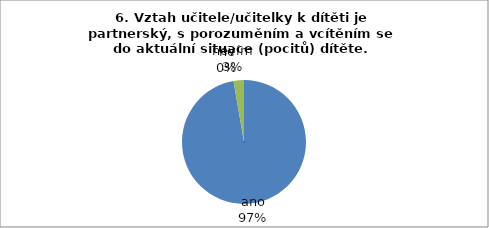
| Category | 6. Vztah učitele/učitelky k dítěti je partnerský, s porozuměním a vcítěním se do aktuální situace (pocitů) dítěte. |
|---|---|
| ano | 36 |
| ne | 0 |
| nevím | 1 |